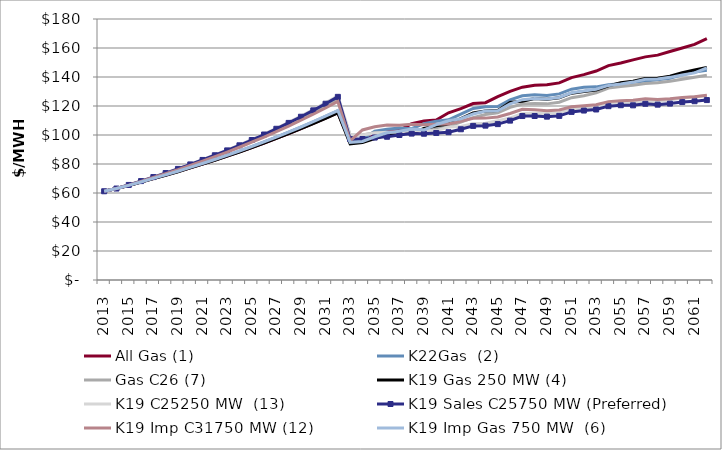
| Category | All Gas (1) | K22Gas  (2) | Gas C26 (7) | K19 Gas 250 MW (4) | K19 C25250 MW  (13) | K19 Sales C25750 MW (Preferred) | K19 Imp C31750 MW (12) | K19 Imp Gas 750 MW  (6) |
|---|---|---|---|---|---|---|---|---|
| 2013.0 | 61.2 | 61.2 | 61.2 | 61.2 | 61.2 | 61.2 | 61.2 | 61.2 |
| 2014.0 | 63.08 | 63.08 | 63.08 | 63.08 | 63.08 | 63.08 | 63.08 | 63.08 |
| 2015.0 | 65.22 | 65.26 | 65.49 | 65.22 | 65.57 | 65.55 | 65.45 | 65.26 |
| 2016.0 | 67.54 | 67.63 | 68.1 | 67.53 | 68.26 | 68.22 | 68.03 | 67.63 |
| 2017.0 | 69.93 | 70.06 | 70.8 | 69.91 | 71.04 | 70.99 | 70.68 | 70.07 |
| 2018.0 | 72.29 | 72.47 | 73.49 | 72.27 | 73.83 | 73.75 | 73.33 | 72.49 |
| 2019.0 | 74.72 | 74.96 | 76.28 | 74.69 | 76.72 | 76.61 | 76.06 | 74.98 |
| 2020.0 | 77.34 | 77.64 | 79.29 | 77.31 | 79.84 | 79.71 | 79.02 | 77.66 |
| 2021.0 | 79.95 | 80.3 | 82.29 | 79.91 | 82.96 | 82.8 | 81.97 | 80.33 |
| 2022.0 | 82.64 | 83.07 | 85.43 | 82.6 | 86.21 | 86.03 | 85.04 | 83.1 |
| 2023.0 | 85.43 | 85.92 | 88.67 | 85.38 | 89.6 | 89.38 | 88.23 | 85.97 |
| 2024.0 | 88.35 | 88.91 | 92.08 | 88.29 | 93.14 | 92.89 | 91.56 | 88.96 |
| 2025.0 | 91.37 | 92.01 | 95.62 | 91.3 | 96.83 | 96.55 | 95.03 | 92.06 |
| 2026.0 | 94.48 | 95.2 | 99.28 | 94.4 | 100.66 | 100.33 | 98.61 | 95.26 |
| 2027.0 | 97.7 | 98.51 | 103.09 | 97.61 | 104.64 | 104.28 | 102.34 | 98.58 |
| 2028.0 | 101.01 | 101.91 | 107.03 | 100.92 | 108.76 | 108.35 | 106.19 | 101.99 |
| 2029.0 | 104.43 | 105.43 | 111.11 | 104.33 | 113.05 | 112.59 | 110.18 | 105.52 |
| 2030.0 | 107.97 | 109.08 | 115.36 | 107.86 | 117.5 | 116.99 | 114.32 | 109.17 |
| 2031.0 | 111.62 | 112.84 | 119.76 | 111.5 | 122.12 | 121.56 | 118.62 | 112.94 |
| 2032.0 | 115.41 | 116.74 | 124.33 | 115.27 | 126.93 | 126.31 | 123.08 | 116.85 |
| 2033.0 | 95.18 | 97.06 | 99.94 | 93.88 | 100.07 | 97.19 | 95.94 | 94.83 |
| 2034.0 | 96.48 | 96.87 | 100.04 | 94.75 | 100.05 | 97.24 | 103.48 | 95.58 |
| 2035.0 | 101.6 | 102.7 | 101.5 | 97.49 | 101.31 | 98.24 | 105.7 | 98.79 |
| 2036.0 | 102.9 | 104.01 | 101.61 | 99.95 | 101.89 | 98.79 | 106.88 | 101.55 |
| 2037.0 | 103.18 | 104.89 | 101.44 | 101.22 | 102.15 | 100 | 106.81 | 102.53 |
| 2038.0 | 107.77 | 104.36 | 102.37 | 100.91 | 102.9 | 100.97 | 107.34 | 104.1 |
| 2039.0 | 109.61 | 107.83 | 103.94 | 104.5 | 102.92 | 100.89 | 107.08 | 103.54 |
| 2040.0 | 110.37 | 109.48 | 104.8 | 106.3 | 102.89 | 101.41 | 107.35 | 107.11 |
| 2041.0 | 115.33 | 110.44 | 106.21 | 107.52 | 105.53 | 101.92 | 107.62 | 109.86 |
| 2042.0 | 118.13 | 114.42 | 108.96 | 111.38 | 105.92 | 103.96 | 109.53 | 111.2 |
| 2043.0 | 121.71 | 118.27 | 111.99 | 115.24 | 107.8 | 106.27 | 111.59 | 114.48 |
| 2044.0 | 122.27 | 119.54 | 114.12 | 116.55 | 108.13 | 106.46 | 111.64 | 116.58 |
| 2045.0 | 126.52 | 119.57 | 115.25 | 116.94 | 109.92 | 107.51 | 112.47 | 116.73 |
| 2046.0 | 130.11 | 124.23 | 119.05 | 122.51 | 111.68 | 109.92 | 114.81 | 121.5 |
| 2047.0 | 133 | 127.02 | 121.42 | 123.35 | 114.81 | 113.08 | 117.69 | 124.35 |
| 2048.0 | 134.38 | 127.77 | 121.7 | 125.13 | 114.95 | 113.1 | 117.33 | 125.18 |
| 2049.0 | 134.62 | 127.28 | 121.47 | 124.72 | 114.58 | 112.66 | 116.67 | 124.79 |
| 2050.0 | 135.95 | 128.35 | 122.57 | 125.75 | 115.24 | 113.18 | 117.24 | 125.88 |
| 2051.0 | 139.61 | 131.58 | 125.73 | 128.82 | 117.77 | 115.93 | 119.48 | 129.12 |
| 2052.0 | 141.61 | 132.98 | 127.11 | 129.97 | 118.59 | 116.87 | 120.25 | 130.28 |
| 2053.0 | 144.1 | 133.19 | 129.05 | 131.06 | 119.37 | 117.6 | 120.92 | 131.54 |
| 2054.0 | 147.88 | 134.68 | 132.34 | 133.92 | 121.88 | 119.89 | 123.02 | 134.18 |
| 2055.0 | 149.64 | 135.34 | 133.51 | 136.03 | 122.76 | 120.56 | 123.56 | 135.21 |
| 2056.0 | 151.82 | 136.38 | 134.28 | 137.14 | 122.21 | 120.46 | 124.01 | 136.48 |
| 2057.0 | 153.87 | 137.31 | 135.46 | 139.02 | 123.17 | 121.53 | 124.99 | 138.39 |
| 2058.0 | 155.07 | 138.07 | 136.07 | 139.2 | 123.09 | 120.93 | 124.45 | 138.56 |
| 2059.0 | 157.59 | 139.2 | 137.14 | 140.5 | 124.14 | 121.65 | 125 | 139.76 |
| 2060.0 | 160 | 141.6 | 138.5 | 142.88 | 125.45 | 122.71 | 125.89 | 141.44 |
| 2061.0 | 162.52 | 143.35 | 139.85 | 144.9 | 126.35 | 123.3 | 126.46 | 142.82 |
| 2062.0 | 166.48 | 144.68 | 141.2 | 146.56 | 127.13 | 124.09 | 127.39 | 146.33 |